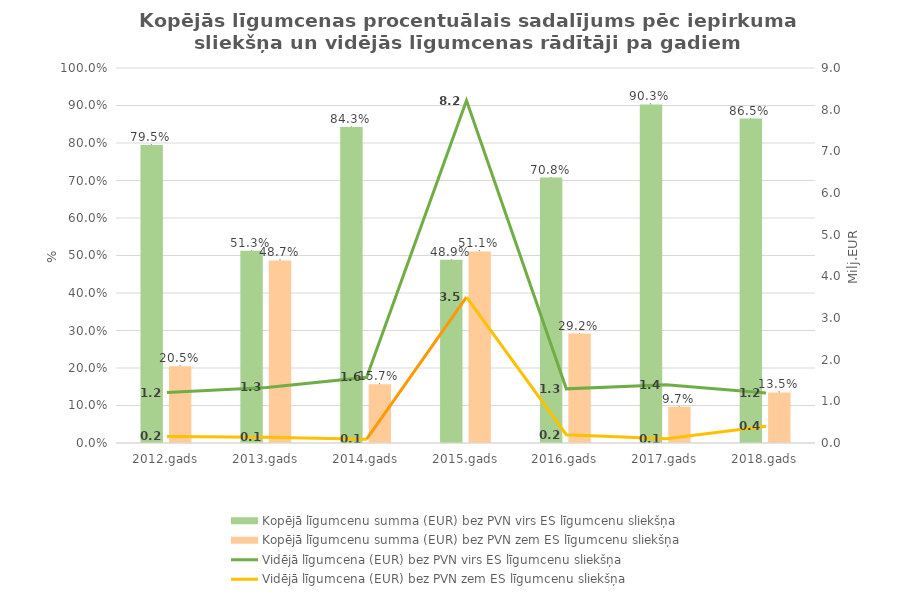
| Category | Kopējā līgumcenu summa (EUR) bez PVN |
|---|---|
| 2012.gads | 0.205 |
| 2013.gads | 0.487 |
| 2014.gads | 0.157 |
| 2015.gads | 0.511 |
| 2016.gads | 0.292 |
| 2017.gads | 0.097 |
| 2018.gads | 0.135 |